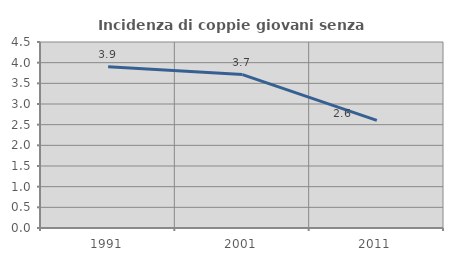
| Category | Incidenza di coppie giovani senza figli |
|---|---|
| 1991.0 | 3.899 |
| 2001.0 | 3.712 |
| 2011.0 | 2.603 |